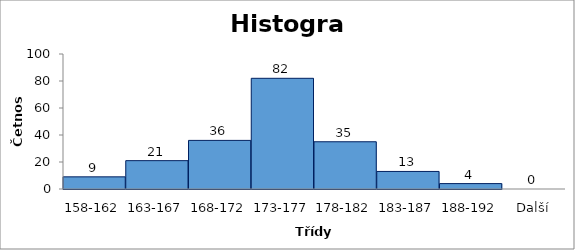
| Category | Četnost |
|---|---|
| 158-162 | 9 |
| 163-167 | 21 |
| 168-172 | 36 |
| 173-177 | 82 |
| 178-182 | 35 |
| 183-187 | 13 |
| 188-192 | 4 |
| Další | 0 |